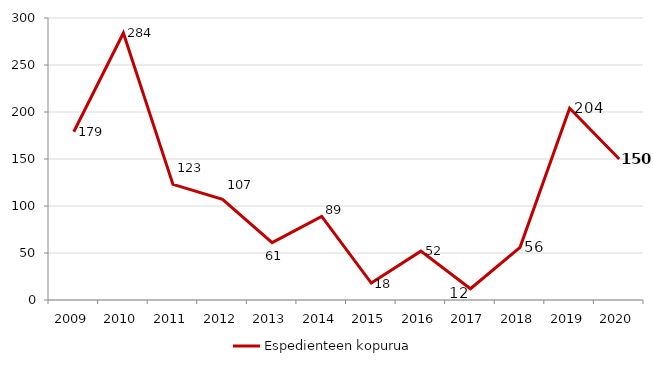
| Category | Espedienteen kopurua |
|---|---|
| 2009.0 | 179 |
| 2010.0 | 284 |
| 2011.0 | 123 |
| 2012.0 | 107 |
| 2013.0 | 61 |
| 2014.0 | 89 |
| 2015.0 | 18 |
| 2016.0 | 52 |
| 2017.0 | 12 |
| 2018.0 | 56 |
| 2019.0 | 204 |
| 2020.0 | 150 |